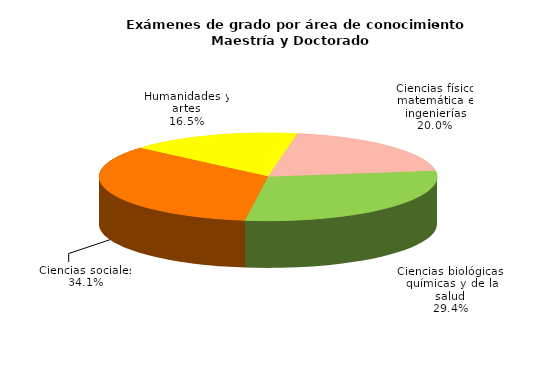
| Category | Series 0 | Series 1 |
|---|---|---|
| Ciencias físico matemática e ingenierías | 656 | 201 |
| Ciencias biológicas, químicas y de la salud | 966 | 327 |
| Ciencias sociales | 1121 | 219 |
| Humanidades y artes | 541 | 198 |